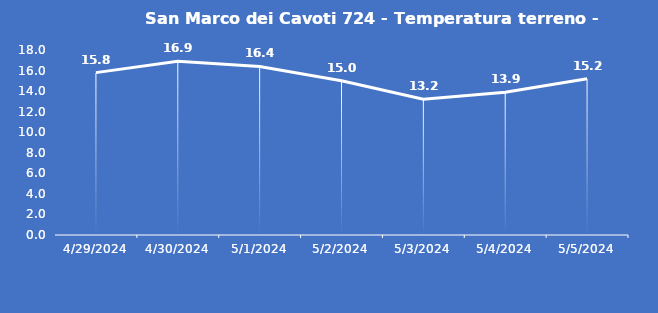
| Category | San Marco dei Cavoti 724 - Temperatura terreno - Grezzo (°C) |
|---|---|
| 4/29/24 | 15.8 |
| 4/30/24 | 16.9 |
| 5/1/24 | 16.4 |
| 5/2/24 | 15 |
| 5/3/24 | 13.2 |
| 5/4/24 | 13.9 |
| 5/5/24 | 15.2 |